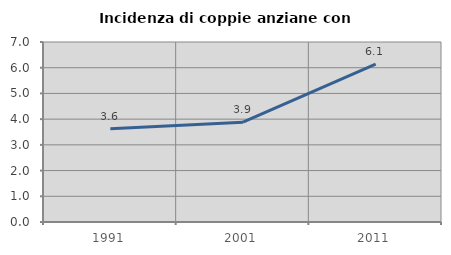
| Category | Incidenza di coppie anziane con figli |
|---|---|
| 1991.0 | 3.623 |
| 2001.0 | 3.879 |
| 2011.0 | 6.14 |